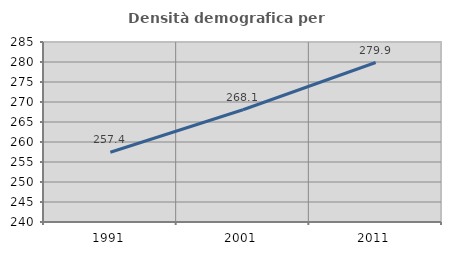
| Category | Densità demografica |
|---|---|
| 1991.0 | 257.436 |
| 2001.0 | 268.06 |
| 2011.0 | 279.874 |